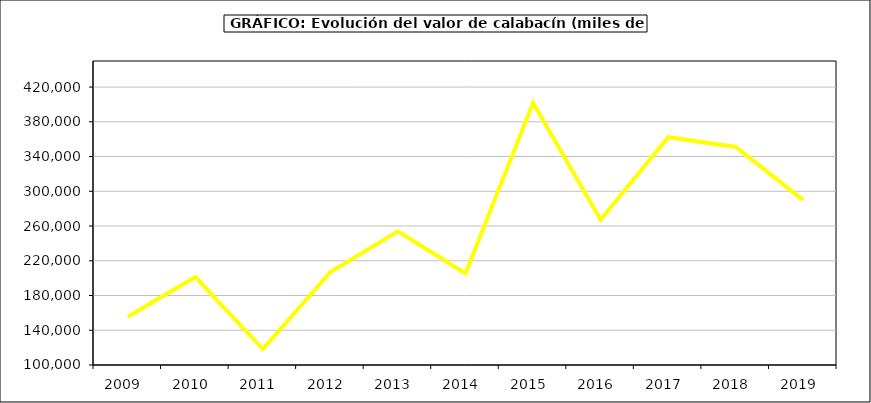
| Category | Valor |
|---|---|
| 2009.0 | 155520.785 |
| 2010.0 | 201170.752 |
| 2011.0 | 118311.354 |
| 2012.0 | 207035.363 |
| 2013.0 | 253994.073 |
| 2014.0 | 205307.232 |
| 2015.0 | 401801.34 |
| 2016.0 | 267259 |
| 2017.0 | 362286.358 |
| 2018.0 | 351050.64 |
| 2019.0 | 289805.222 |